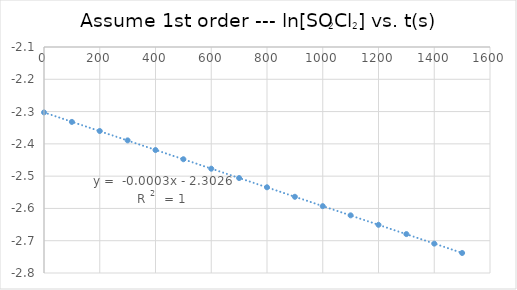
| Category | ln[] |
|---|---|
| 0.0 | -2.303 |
| 100.0 | -2.332 |
| 200.0 | -2.36 |
| 300.0 | -2.389 |
| 400.0 | -2.419 |
| 500.0 | -2.448 |
| 600.0 | -2.477 |
| 700.0 | -2.506 |
| 800.0 | -2.535 |
| 900.0 | -2.564 |
| 1000.0 | -2.593 |
| 1100.0 | -2.621 |
| 1200.0 | -2.651 |
| 1300.0 | -2.679 |
| 1400.0 | -2.709 |
| 1500.0 | -2.738 |